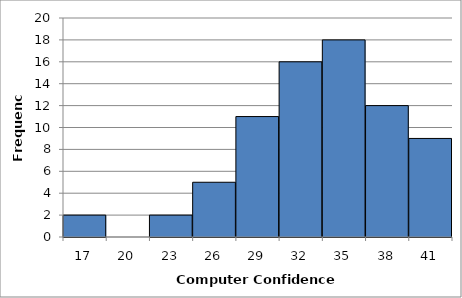
| Category | Series 0 |
|---|---|
| 17.0 | 2 |
| 20.0 | 0 |
| 23.0 | 2 |
| 26.0 | 5 |
| 29.0 | 11 |
| 32.0 | 16 |
| 35.0 | 18 |
| 38.0 | 12 |
| 41.0 | 9 |